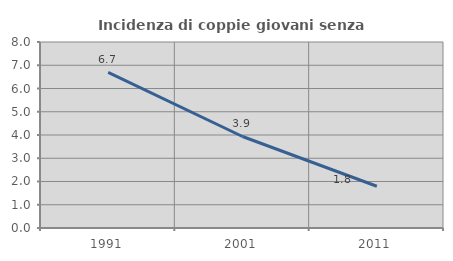
| Category | Incidenza di coppie giovani senza figli |
|---|---|
| 1991.0 | 6.691 |
| 2001.0 | 3.936 |
| 2011.0 | 1.795 |